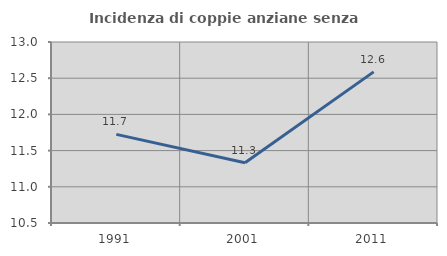
| Category | Incidenza di coppie anziane senza figli  |
|---|---|
| 1991.0 | 11.724 |
| 2001.0 | 11.333 |
| 2011.0 | 12.587 |